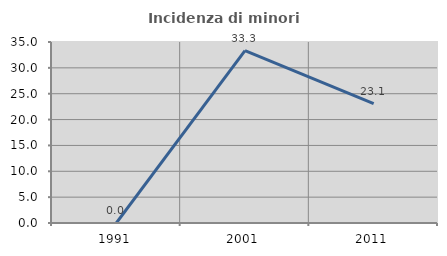
| Category | Incidenza di minori stranieri |
|---|---|
| 1991.0 | 0 |
| 2001.0 | 33.333 |
| 2011.0 | 23.077 |